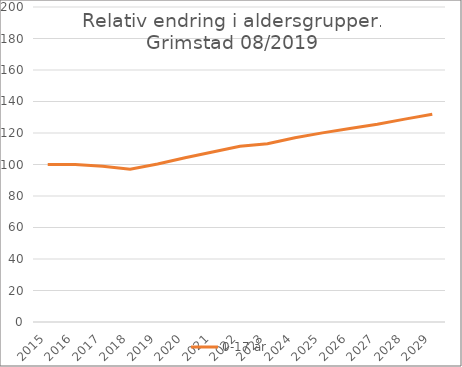
| Category | 0-17 år |
|---|---|
| 2015.0 | 100 |
| 2016.0 | 100 |
| 2017.0 | 98.846 |
| 2018.0 | 96.923 |
| 2019.0 | 100.309 |
| 2020.0 | 104.237 |
| 2021.0 | 107.967 |
| 2022.0 | 111.606 |
| 2023.0 | 113.211 |
| 2024.0 | 116.96 |
| 2025.0 | 120.075 |
| 2026.0 | 122.903 |
| 2027.0 | 125.575 |
| 2028.0 | 128.817 |
| 2029.0 | 131.908 |